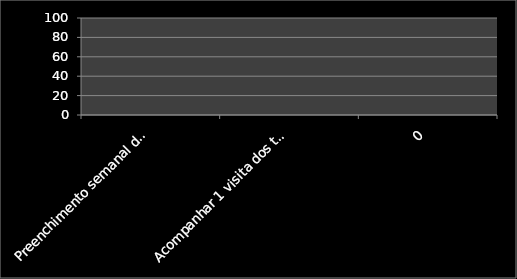
| Category | Inicio % | % |
|---|---|---|
| Preenchimento semanal do Gesto | 0 | 0 |
| Acompanhar 1 visita dos técnicos da SEDETUR/NATURATINS para diagnóstico dos atrativos da APA | 0 | 0 |
| 0 | 0 | 0 |